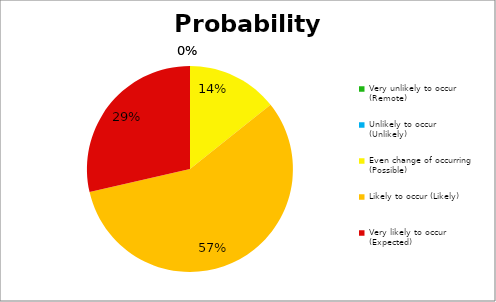
| Category | Percent |
|---|---|
| Very unlikely to occur (Remote) | 0 |
| Unlikely to occur (Unlikely) | 0 |
| Even change of occurring (Possible) | 1 |
| Likely to occur (Likely) | 4 |
| Very likely to occur (Expected) | 2 |